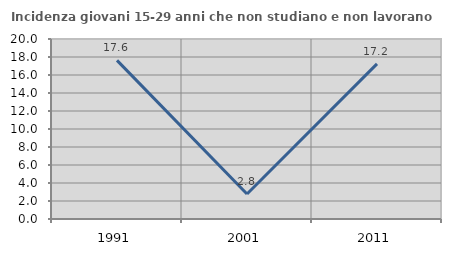
| Category | Incidenza giovani 15-29 anni che non studiano e non lavorano  |
|---|---|
| 1991.0 | 17.626 |
| 2001.0 | 2.778 |
| 2011.0 | 17.241 |